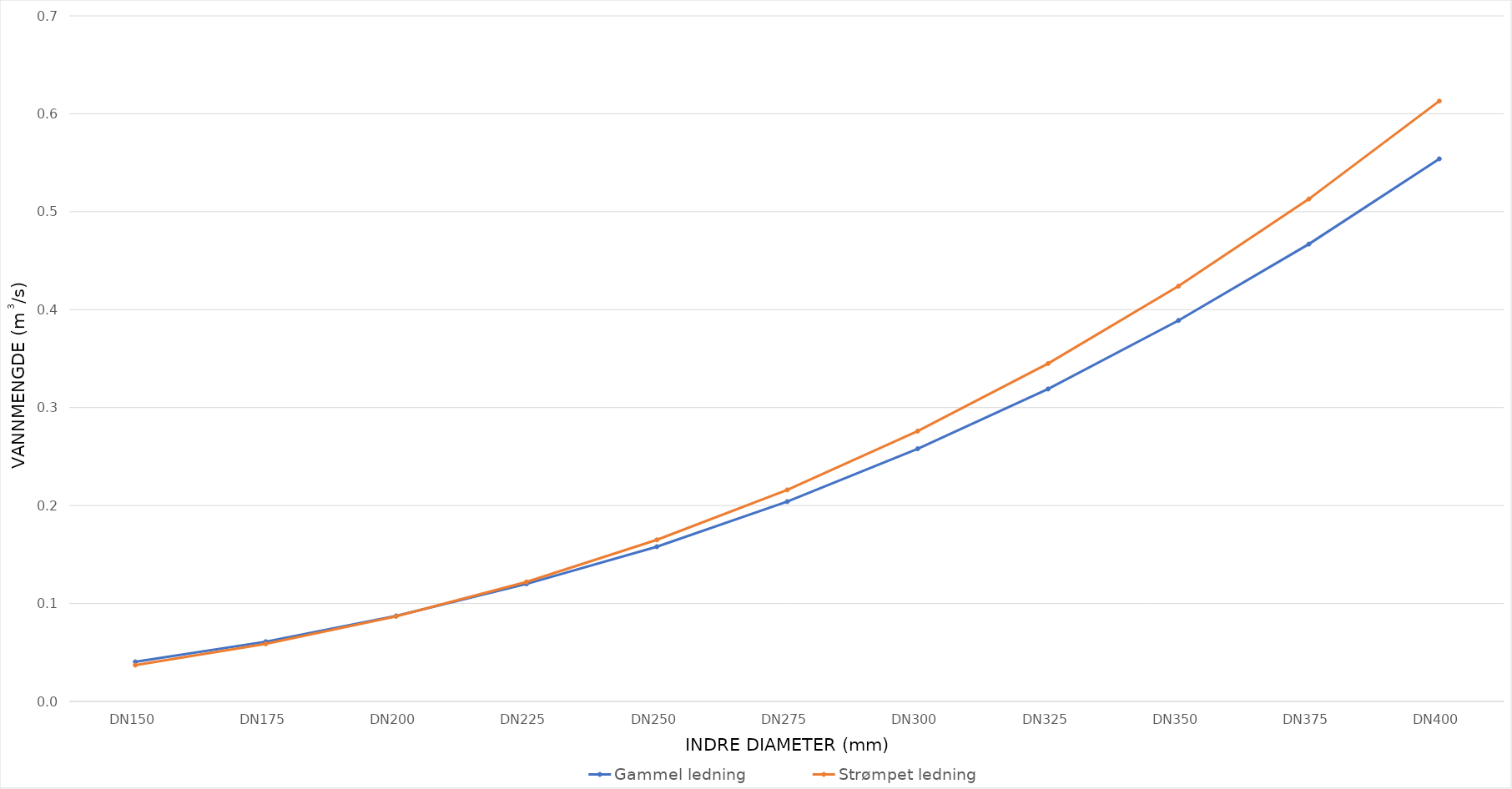
| Category | Gammel ledning | Strømpet ledning |
|---|---|---|
| DN150 | 0.04 | 0.037 |
| DN175 | 0.061 | 0.059 |
| DN200 | 0.087 | 0.087 |
| DN225 | 0.12 | 0.122 |
| DN250 | 0.158 | 0.165 |
| DN275 | 0.204 | 0.216 |
| DN300 | 0.258 | 0.276 |
| DN325 | 0.319 | 0.345 |
| DN350 | 0.389 | 0.424 |
| DN375 | 0.467 | 0.513 |
| DN400 | 0.554 | 0.613 |